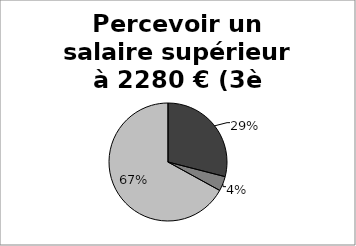
| Category | Percevoir un salaire supérieur à 2280 € (3è quartile) |
|---|---|
| 0 | 0.29 |
| 1 | 0.04 |
| 2 | 0.67 |